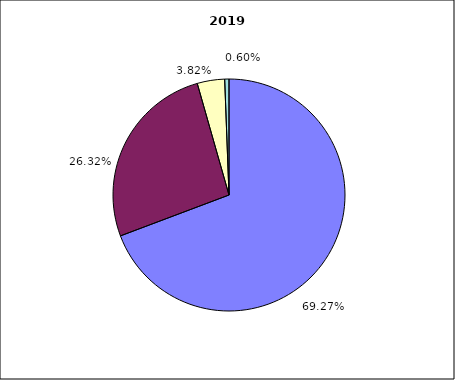
| Category | 2019 |
|---|---|
| Salarissen | 8416220 |
| Werking | 3198025 |
| Investeringen | 463859 |
| Andere | 72421 |